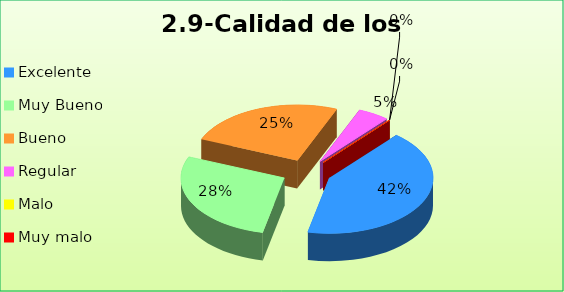
| Category | Series 0 |
|---|---|
| Excelente | 0.422 |
| Muy Bueno | 0.279 |
| Bueno  | 0.25 |
| Regular  | 0.049 |
| Malo  | 0 |
| Muy malo  | 0 |